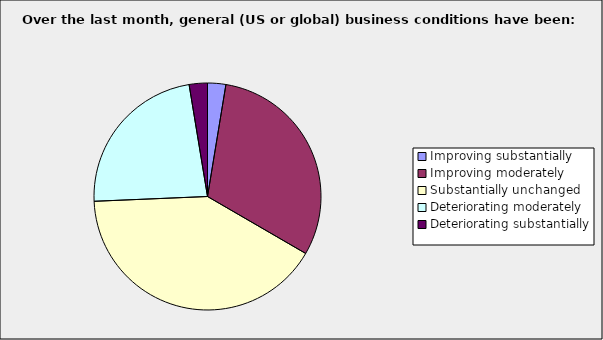
| Category | Series 0 |
|---|---|
| Improving substantially | 0.026 |
| Improving moderately | 0.308 |
| Substantially unchanged | 0.41 |
| Deteriorating moderately | 0.231 |
| Deteriorating substantially | 0.026 |